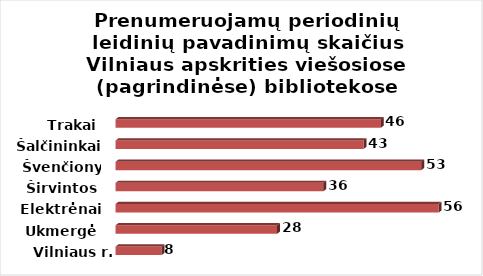
| Category | Series 0 |
|---|---|
| Vilniaus r. | 8 |
| Ukmergė | 28 |
| Elektrėnai | 56 |
| Širvintos | 36 |
| Švenčionys | 53 |
| Šalčininkai | 43 |
| Trakai | 46 |